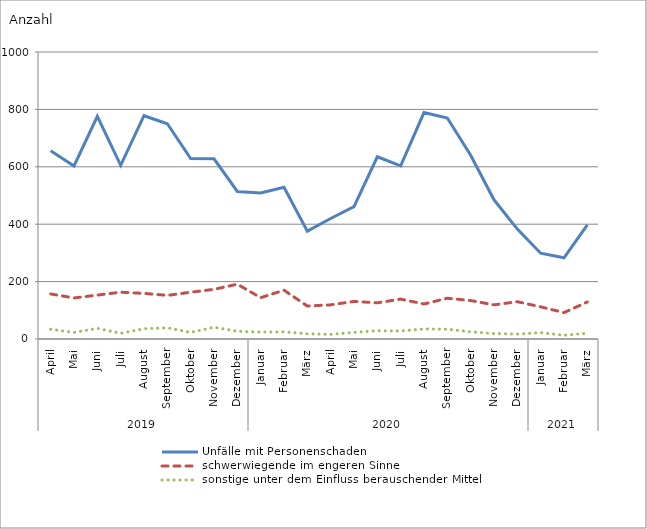
| Category | Unfälle mit Personenschaden | schwerwiegende im engeren Sinne | sonstige unter dem Einfluss berauschender Mittel |
|---|---|---|---|
| 0 | 656 | 157 | 34 |
| 1 | 603 | 143 | 23 |
| 2 | 776 | 153 | 37 |
| 3 | 605 | 163 | 20 |
| 4 | 778 | 159 | 36 |
| 5 | 750 | 152 | 39 |
| 6 | 629 | 163 | 23 |
| 7 | 628 | 173 | 41 |
| 8 | 514 | 191 | 27 |
| 9 | 509 | 144 | 24 |
| 10 | 529 | 170 | 25 |
| 11 | 376 | 115 | 18 |
| 12 | 420 | 119 | 16 |
| 13 | 461 | 131 | 23 |
| 14 | 635 | 126 | 29 |
| 15 | 603 | 139 | 28 |
| 16 | 789 | 122 | 35 |
| 17 | 770 | 142 | 34 |
| 18 | 640 | 134 | 25 |
| 19 | 485 | 119 | 19 |
| 20 | 383 | 130 | 17 |
| 21 | 299 | 112 | 22 |
| 22 | 283 | 92 | 13 |
| 23 | 398 | 129 | 20 |